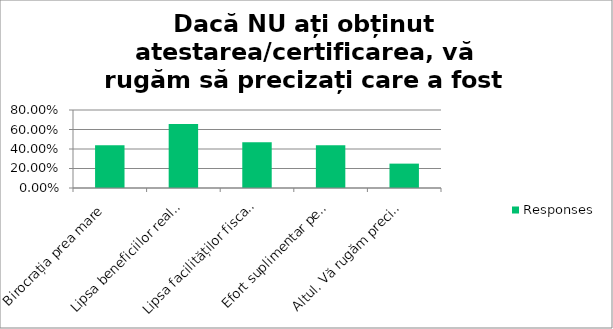
| Category | Responses |
|---|---|
| Birocrația prea mare | 0.438 |
| Lipsa beneficiilor reale pentru întreprinderile sociale | 0.656 |
| Lipsa facilităților fiscale | 0.469 |
| Efort suplimentar pentru completarea rapoartelor și situațiilor solicitate | 0.438 |
| Altul. Vă rugăm precizați. | 0.25 |